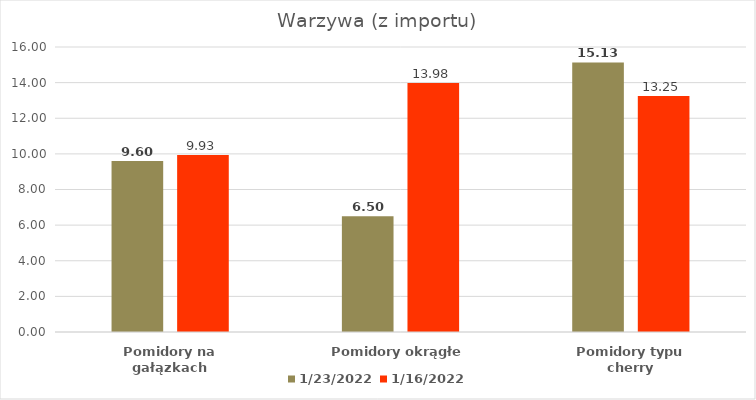
| Category | 2022-01-23 | 2022-01-16 |
|---|---|---|
| Pomidory na gałązkach | 9.6 | 9.93 |
| Pomidory okrągłe | 6.5 | 13.98 |
| Pomidory typu cherry | 15.13 | 13.25 |